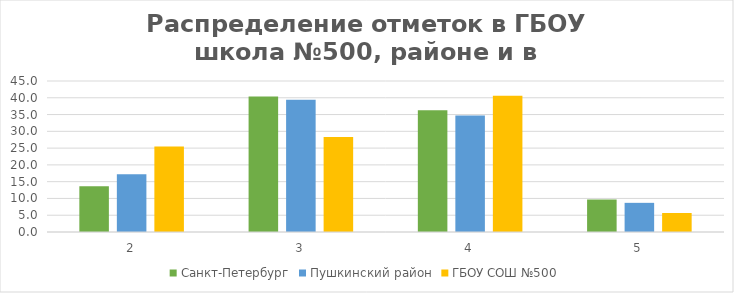
| Category | Санкт-Петербург | Пушкинский район | ГБОУ СОШ №500 |
|---|---|---|---|
| 2.0 | 13.63 | 17.18 | 25.47 |
| 3.0 | 40.4 | 39.43 | 28.3 |
| 4.0 | 36.32 | 34.69 | 40.57 |
| 5.0 | 9.66 | 8.69 | 5.66 |